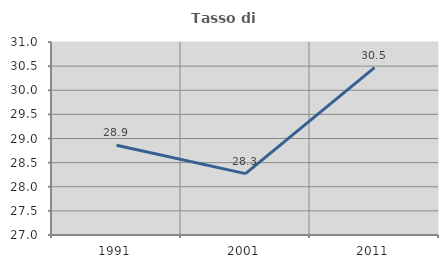
| Category | Tasso di occupazione   |
|---|---|
| 1991.0 | 28.862 |
| 2001.0 | 28.272 |
| 2011.0 | 30.469 |